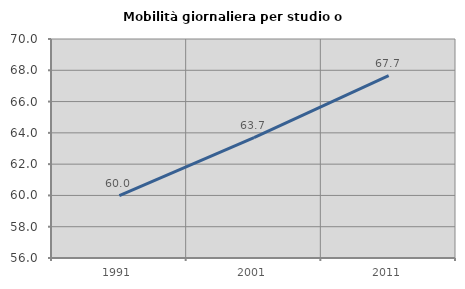
| Category | Mobilità giornaliera per studio o lavoro |
|---|---|
| 1991.0 | 59.983 |
| 2001.0 | 63.689 |
| 2011.0 | 67.654 |